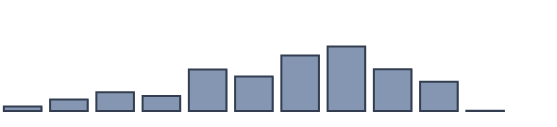
| Category | Series 0 |
|---|---|
| 0 | 1.4 |
| 1 | 3.6 |
| 2 | 5.9 |
| 3 | 4.7 |
| 4 | 13.1 |
| 5 | 10.9 |
| 6 | 17.5 |
| 7 | 20.3 |
| 8 | 13.2 |
| 9 | 9.2 |
| 10 | 0.1 |
| 11 | 0 |